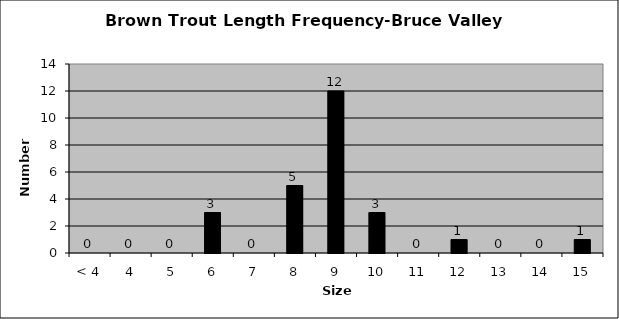
| Category | Series 0 |
|---|---|
| < 4 | 0 |
| 4 | 0 |
| 5 | 0 |
| 6 | 3 |
| 7 | 0 |
| 8 | 5 |
| 9 | 12 |
| 10 | 3 |
| 11 | 0 |
| 12 | 1 |
| 13 | 0 |
| 14 | 0 |
| 15 | 1 |